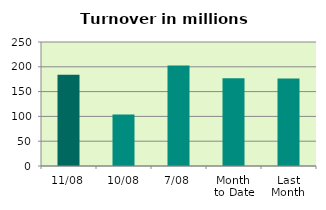
| Category | Series 0 |
|---|---|
| 11/08 | 184.144 |
| 10/08 | 103.767 |
| 7/08 | 202.702 |
| Month 
to Date | 176.719 |
| Last
Month | 176.477 |